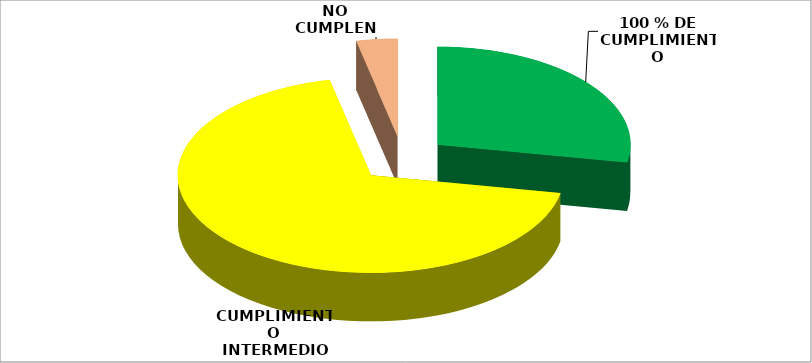
| Category | Series 0 |
|---|---|
| 100 % DE CUMPLIMIENTO | 122 |
| CUMPLIMIENTO INTERMEDIO | 300 |
| NO CUMPLEN | 15 |